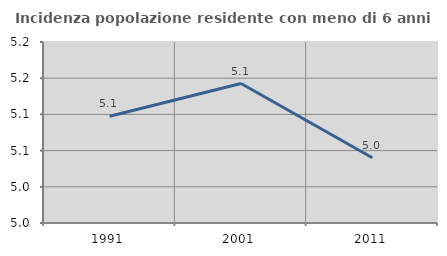
| Category | Incidenza popolazione residente con meno di 6 anni |
|---|---|
| 1991.0 | 5.098 |
| 2001.0 | 5.143 |
| 2011.0 | 5.04 |